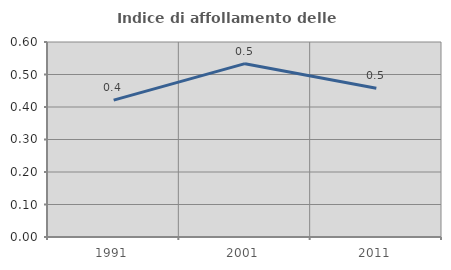
| Category | Indice di affollamento delle abitazioni  |
|---|---|
| 1991.0 | 0.421 |
| 2001.0 | 0.533 |
| 2011.0 | 0.458 |